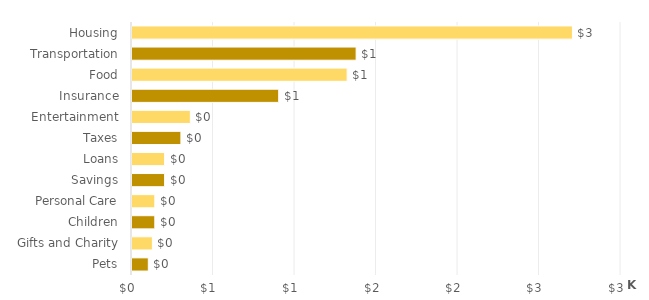
| Category | Total |
|---|---|
| Pets | 100 |
| Gifts and Charity | 125 |
| Children | 140 |
| Personal Care | 140 |
| Savings | 200 |
| Loans | 200 |
| Taxes | 300 |
| Entertainment | 358 |
| Insurance | 900 |
| Food | 1320 |
| Transportation | 1375 |
| Housing | 2702 |